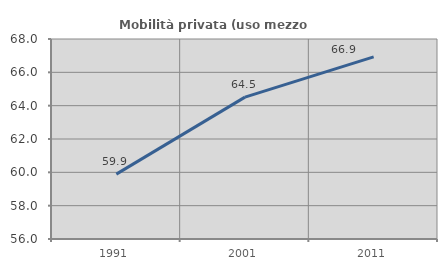
| Category | Mobilità privata (uso mezzo privato) |
|---|---|
| 1991.0 | 59.894 |
| 2001.0 | 64.513 |
| 2011.0 | 66.925 |